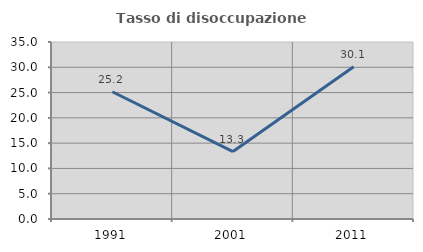
| Category | Tasso di disoccupazione giovanile  |
|---|---|
| 1991.0 | 25.166 |
| 2001.0 | 13.333 |
| 2011.0 | 30.108 |